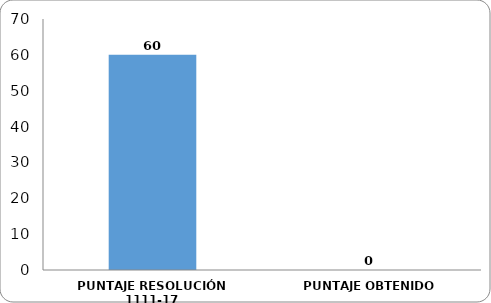
| Category | II. HACER |
|---|---|
| PUNTAJE RESOLUCIÓN 1111-17 | 60 |
| PUNTAJE OBTENIDO | 0 |